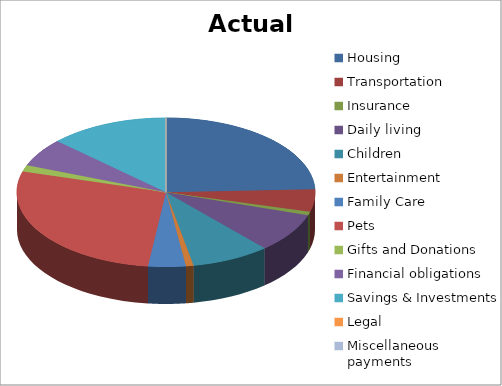
| Category | Actual |
|---|---|
| Housing | 600 |
| Transportation | 120 |
| Insurance | 20 |
| Daily living | 210 |
| Children | 210 |
| Entertainment | 20 |
| Family Care | 100 |
| Pets | 680 |
| Gifts and Donations | 35 |
| Financial obligations | 150 |
| Savings & Investments | 320 |
| Legal | 0 |
| Miscellaneous payments | 0 |